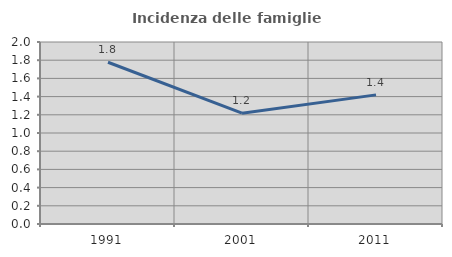
| Category | Incidenza delle famiglie numerose |
|---|---|
| 1991.0 | 1.777 |
| 2001.0 | 1.217 |
| 2011.0 | 1.419 |